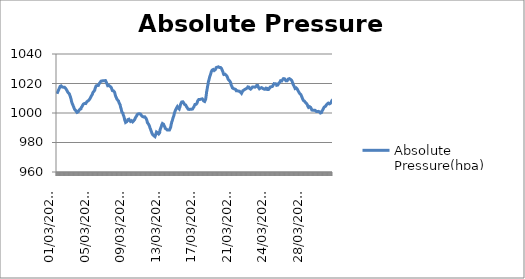
| Category | Absolute Pressure(hpa) |
|---|---|
|  01/03/2022 00:20:09 | 1013 |
|  01/03/2022 00:50:09 | 1013.4 |
|  01/03/2022 01:20:09 | 1013.9 |
|  01/03/2022 01:50:09 | 1014.2 |
|  01/03/2022 02:20:09 | 1014.2 |
|  01/03/2022 02:50:09 | 1014.7 |
|  01/03/2022 03:20:09 | 1015 |
|  01/03/2022 03:50:09 | 1015.4 |
|  01/03/2022 04:20:09 | 1015.5 |
|  01/03/2022 04:50:09 | 1015.8 |
|  01/03/2022 05:20:09 | 1016.2 |
|  01/03/2022 05:50:09 | 1016.1 |
|  01/03/2022 06:20:09 | 1016.4 |
|  01/03/2022 06:50:09 | 1017 |
|  01/03/2022 07:20:09 | 1017.1 |
|  01/03/2022 07:50:09 | 1017.5 |
|  01/03/2022 08:20:09 | 1018 |
|  01/03/2022 08:50:09 | 1017.9 |
|  01/03/2022 09:20:09 | 1018.4 |
|  01/03/2022 09:50:09 | 1018.4 |
|  01/03/2022 10:20:09 | 1018.3 |
|  01/03/2022 10:50:09 | 1018.1 |
|  01/03/2022 11:20:09 | 1018.4 |
|  01/03/2022 11:50:09 | 1018.5 |
|  01/03/2022 12:20:09 | 1018.3 |
|  01/03/2022 12:50:09 | 1018.2 |
|  01/03/2022 15:54:06 | 1017.9 |
|  01/03/2022 16:24:06 | 1017.9 |
|  01/03/2022 16:54:06 | 1017.6 |
|  01/03/2022 17:24:06 | 1017.4 |
|  01/03/2022 17:54:06 | 1017.5 |
|  01/03/2022 18:24:06 | 1017.3 |
|  01/03/2022 18:54:06 | 1017.3 |
|  01/03/2022 19:24:06 | 1017.6 |
|  01/03/2022 19:54:06 | 1017.5 |
|  01/03/2022 20:24:06 | 1017.7 |
|  01/03/2022 20:54:06 | 1017.8 |
|  01/03/2022 21:24:06 | 1017.3 |
|  01/03/2022 21:54:06 | 1017.4 |
|  01/03/2022 22:24:06 | 1017.6 |
|  01/03/2022 22:54:06 | 1017.5 |
|  01/03/2022 23:24:06 | 1017.5 |
|  01/03/2022 23:54:06 | 1017.1 |
|  02/03/2022 00:24:06 | 1016.9 |
|  02/03/2022 00:54:06 | 1017 |
|  02/03/2022 01:24:06 | 1016.8 |
|  02/03/2022 01:54:06 | 1016.5 |
|  02/03/2022 02:24:06 | 1016.4 |
|  02/03/2022 02:54:06 | 1016.3 |
|  02/03/2022 03:24:06 | 1016.1 |
|  02/03/2022 03:54:06 | 1016.1 |
|  02/03/2022 04:24:06 | 1016 |
|  02/03/2022 04:54:06 | 1015.8 |
|  02/03/2022 05:24:06 | 1015.2 |
|  02/03/2022 05:54:06 | 1015 |
|  02/03/2022 06:24:06 | 1014.9 |
|  02/03/2022 06:54:06 | 1014.4 |
|  02/03/2022 07:24:06 | 1014 |
|  02/03/2022 07:54:06 | 1014.1 |
|  02/03/2022 08:24:06 | 1014.2 |
|  02/03/2022 08:54:06 | 1013.7 |
|  02/03/2022 09:24:06 | 1013.5 |
|  02/03/2022 09:54:06 | 1013.6 |
|  02/03/2022 10:24:06 | 1013.8 |
|  02/03/2022 10:54:06 | 1013.5 |
|  02/03/2022 11:24:06 | 1013.2 |
|  02/03/2022 11:54:06 | 1012.9 |
|  02/03/2022 12:24:06 | 1012.5 |
|  02/03/2022 12:54:06 | 1012.2 |
|  02/03/2022 13:24:06 | 1012.4 |
|  02/03/2022 13:54:06 | 1011.8 |
|  02/03/2022 14:24:06 | 1011.1 |
|  02/03/2022 14:54:06 | 1010.8 |
|  02/03/2022 15:24:06 | 1010.3 |
|  02/03/2022 15:54:06 | 1010 |
|  02/03/2022 16:24:06 | 1009.5 |
|  02/03/2022 16:54:06 | 1008.8 |
|  02/03/2022 17:24:06 | 1008.3 |
|  02/03/2022 17:54:06 | 1007.6 |
|  02/03/2022 18:24:06 | 1007.2 |
|  02/03/2022 18:54:06 | 1007 |
|  02/03/2022 19:24:06 | 1006.5 |
|  02/03/2022 19:54:06 | 1006.4 |
|  02/03/2022 20:24:06 | 1006.1 |
|  02/03/2022 20:54:06 | 1005.7 |
|  02/03/2022 21:24:06 | 1005.6 |
|  02/03/2022 21:54:06 | 1005 |
|  02/03/2022 22:24:06 | 1004.8 |
|  02/03/2022 22:54:06 | 1004.5 |
|  02/03/2022 23:24:06 | 1004.1 |
|  02/03/2022 23:54:06 | 1003.6 |
|  03/03/2022 00:24:06 | 1003.4 |
|  03/03/2022 00:54:06 | 1003.1 |
|  03/03/2022 01:24:06 | 1002.9 |
|  03/03/2022 01:54:06 | 1002.5 |
|  03/03/2022 02:24:06 | 1002.9 |
|  03/03/2022 02:54:06 | 1002.5 |
|  03/03/2022 03:24:06 | 1002.5 |
|  03/03/2022 03:54:06 | 1002.4 |
|  03/03/2022 04:24:06 | 1002 |
|  03/03/2022 04:54:06 | 1001.8 |
|  03/03/2022 05:24:06 | 1001.5 |
|  03/03/2022 05:54:06 | 1001.1 |
|  03/03/2022 06:24:06 | 1000.8 |
|  03/03/2022 06:54:06 | 1000.7 |
|  03/03/2022 07:24:06 | 1000.5 |
|  03/03/2022 07:54:06 | 1000.5 |
|  03/03/2022 08:24:06 | 1000.4 |
|  03/03/2022 08:54:06 | 1000.1 |
|  03/03/2022 09:24:06 | 1000.6 |
|  03/03/2022 09:54:06 | 1000.4 |
|  03/03/2022 10:24:06 | 1000.6 |
|  03/03/2022 10:54:06 | 1000.4 |
|  03/03/2022 11:24:06 | 1000.8 |
|  03/03/2022 11:54:06 | 1001 |
|  03/03/2022 12:24:06 | 1001.2 |
|  03/03/2022 12:54:06 | 1001.5 |
|  03/03/2022 13:24:06 | 1001.5 |
|  03/03/2022 13:54:06 | 1001.8 |
|  03/03/2022 14:24:06 | 1001.9 |
|  03/03/2022 14:54:06 | 1001.9 |
|  03/03/2022 15:24:06 | 1002.1 |
|  03/03/2022 15:54:06 | 1002.4 |
|  03/03/2022 16:24:06 | 1002.6 |
|  03/03/2022 16:54:06 | 1002.8 |
|  03/03/2022 17:24:06 | 1002.6 |
|  03/03/2022 17:54:06 | 1002.8 |
|  03/03/2022 18:24:06 | 1002.6 |
|  03/03/2022 18:54:06 | 1002.8 |
|  03/03/2022 19:24:06 | 1003.5 |
|  03/03/2022 19:54:06 | 1003.5 |
|  03/03/2022 20:24:06 | 1003.8 |
|  03/03/2022 20:54:06 | 1003.8 |
|  03/03/2022 21:24:06 | 1004.1 |
|  03/03/2022 21:54:06 | 1004.4 |
|  03/03/2022 22:24:06 | 1004.5 |
|  03/03/2022 22:54:06 | 1004.8 |
|  03/03/2022 23:24:06 | 1004.9 |
|  03/03/2022 23:54:06 | 1005.4 |
|  04/03/2022 00:24:06 | 1005.4 |
|  04/03/2022 00:54:06 | 1005.6 |
|  04/03/2022 01:24:06 | 1005.8 |
|  04/03/2022 01:54:06 | 1006.1 |
|  04/03/2022 02:24:06 | 1006.3 |
|  04/03/2022 02:54:06 | 1006.3 |
|  04/03/2022 03:24:06 | 1006.4 |
|  04/03/2022 03:54:06 | 1006.3 |
|  04/03/2022 04:24:06 | 1006.4 |
|  04/03/2022 04:54:06 | 1006.5 |
|  04/03/2022 05:24:06 | 1006.7 |
|  04/03/2022 05:54:06 | 1006.4 |
|  04/03/2022 06:24:06 | 1006.8 |
|  04/03/2022 06:54:06 | 1006.5 |
|  04/03/2022 07:24:06 | 1006.6 |
|  04/03/2022 07:54:06 | 1006.4 |
|  04/03/2022 08:24:06 | 1006.8 |
|  04/03/2022 08:54:06 | 1007 |
|  04/03/2022 09:24:06 | 1006.8 |
|  04/03/2022 09:54:06 | 1006.9 |
|  04/03/2022 10:24:06 | 1007.5 |
|  04/03/2022 10:54:06 | 1007.5 |
|  04/03/2022 11:24:06 | 1007.6 |
|  04/03/2022 11:54:06 | 1008 |
|  04/03/2022 12:24:06 | 1007.9 |
|  04/03/2022 12:54:06 | 1008 |
|  04/03/2022 13:24:06 | 1008.1 |
|  04/03/2022 13:54:06 | 1008.2 |
|  04/03/2022 14:24:06 | 1008.3 |
|  04/03/2022 14:54:06 | 1008.3 |
|  04/03/2022 15:24:06 | 1008.4 |
|  04/03/2022 15:54:06 | 1008.6 |
|  04/03/2022 16:24:06 | 1008.7 |
|  04/03/2022 16:54:06 | 1008.5 |
|  04/03/2022 17:24:06 | 1008.7 |
|  04/03/2022 17:54:06 | 1008.8 |
|  04/03/2022 18:24:06 | 1009.3 |
|  04/03/2022 18:54:06 | 1009.3 |
|  04/03/2022 19:24:06 | 1009.8 |
|  04/03/2022 19:54:06 | 1010.1 |
|  04/03/2022 20:24:06 | 1010.1 |
|  04/03/2022 20:54:06 | 1010.5 |
|  04/03/2022 21:24:06 | 1010.7 |
|  04/03/2022 21:54:06 | 1010.9 |
|  04/03/2022 22:24:06 | 1011.4 |
|  04/03/2022 22:54:06 | 1011.6 |
|  04/03/2022 23:24:06 | 1011.8 |
|  04/03/2022 23:54:06 | 1011.8 |
|  05/03/2022 00:24:06 | 1012.1 |
|  05/03/2022 00:54:06 | 1012.4 |
|  05/03/2022 01:24:06 | 1012.7 |
|  05/03/2022 01:54:06 | 1012.9 |
|  05/03/2022 02:24:06 | 1013.2 |
|  05/03/2022 02:54:06 | 1013.8 |
|  05/03/2022 03:24:06 | 1013.8 |
|  05/03/2022 03:54:06 | 1014.1 |
|  05/03/2022 04:24:06 | 1014.2 |
|  05/03/2022 04:54:06 | 1014.3 |
|  05/03/2022 05:24:06 | 1014.6 |
|  05/03/2022 05:54:06 | 1015.1 |
|  05/03/2022 06:24:06 | 1015.1 |
|  05/03/2022 06:54:06 | 1015.2 |
|  05/03/2022 07:24:06 | 1015.2 |
|  05/03/2022 07:54:06 | 1015.4 |
|  05/03/2022 08:24:06 | 1015.9 |
|  05/03/2022 08:54:06 | 1016.5 |
|  05/03/2022 09:24:06 | 1016.7 |
|  05/03/2022 09:54:06 | 1016.9 |
|  05/03/2022 10:24:06 | 1017.6 |
|  05/03/2022 10:54:06 | 1017.6 |
|  05/03/2022 11:24:06 | 1017.8 |
|  05/03/2022 11:54:06 | 1018.4 |
|  05/03/2022 12:24:06 | 1018.7 |
|  05/03/2022 12:54:06 | 1018.7 |
|  05/03/2022 13:24:06 | 1018.7 |
|  05/03/2022 13:54:06 | 1018.5 |
|  05/03/2022 14:24:06 | 1018.7 |
|  05/03/2022 14:54:06 | 1018.6 |
|  05/03/2022 15:24:06 | 1018.8 |
|  05/03/2022 15:54:06 | 1018.6 |
|  05/03/2022 16:24:06 | 1018.8 |
|  05/03/2022 16:54:06 | 1019.1 |
|  05/03/2022 17:24:06 | 1018.8 |
|  05/03/2022 17:54:06 | 1018.7 |
|  05/03/2022 18:24:06 | 1019 |
|  05/03/2022 18:54:06 | 1019.4 |
|  05/03/2022 19:24:06 | 1019.6 |
|  05/03/2022 19:54:06 | 1020 |
|  05/03/2022 20:24:06 | 1020 |
|  05/03/2022 20:54:06 | 1020.2 |
|  05/03/2022 21:24:06 | 1020.3 |
|  05/03/2022 21:54:06 | 1020.5 |
|  05/03/2022 22:24:06 | 1020.8 |
|  05/03/2022 22:54:06 | 1020.9 |
|  05/03/2022 23:24:06 | 1021.2 |
|  05/03/2022 23:54:06 | 1021.3 |
|  06/03/2022 00:24:06 | 1021.4 |
|  06/03/2022 00:54:06 | 1021.6 |
|  06/03/2022 01:24:06 | 1021.6 |
|  06/03/2022 01:54:06 | 1021.6 |
|  06/03/2022 02:24:06 | 1021.7 |
|  06/03/2022 02:54:06 | 1021.5 |
|  06/03/2022 03:24:06 | 1021.6 |
|  06/03/2022 03:54:06 | 1021.7 |
|  06/03/2022 04:24:06 | 1022.1 |
|  06/03/2022 04:54:06 | 1021.9 |
|  06/03/2022 05:24:06 | 1022 |
|  06/03/2022 05:54:06 | 1021.9 |
|  06/03/2022 06:24:06 | 1022 |
|  06/03/2022 06:54:06 | 1021.9 |
|  06/03/2022 07:24:06 | 1022 |
|  06/03/2022 07:54:06 | 1022 |
|  06/03/2022 08:24:06 | 1022 |
|  06/03/2022 08:54:06 | 1021.9 |
|  06/03/2022 09:24:06 | 1021.8 |
|  06/03/2022 09:54:06 | 1021.9 |
|  06/03/2022 10:24:06 | 1021.9 |
|  06/03/2022 10:54:06 | 1021.8 |
|  06/03/2022 11:24:06 | 1021.7 |
|  06/03/2022 11:54:06 | 1022 |
|  06/03/2022 12:24:06 | 1022 |
|  06/03/2022 12:54:06 | 1022 |
|  06/03/2022 13:24:06 | 1021.7 |
|  06/03/2022 13:54:06 | 1021.7 |
|  06/03/2022 14:24:06 | 1021.3 |
|  06/03/2022 14:54:06 | 1021.2 |
|  06/03/2022 15:24:06 | 1020.8 |
|  06/03/2022 15:54:06 | 1020.4 |
|  06/03/2022 16:24:06 | 1020.3 |
|  06/03/2022 16:54:06 | 1019.7 |
|  06/03/2022 17:24:06 | 1019.4 |
|  06/03/2022 17:54:06 | 1019.2 |
|  06/03/2022 18:24:06 | 1019.2 |
|  06/03/2022 18:54:06 | 1018.5 |
|  06/03/2022 19:24:06 | 1018.7 |
|  06/03/2022 19:54:06 | 1018.7 |
|  06/03/2022 20:24:06 | 1018.4 |
|  06/03/2022 20:54:06 | 1018.5 |
|  06/03/2022 21:24:06 | 1018.5 |
|  06/03/2022 21:54:06 | 1018.7 |
|  06/03/2022 22:24:06 | 1018.7 |
|  06/03/2022 22:54:06 | 1018.7 |
|  06/03/2022 23:24:06 | 1018.5 |
|  06/03/2022 23:54:06 | 1018.3 |
|  07/03/2022 00:24:06 | 1018.5 |
|  07/03/2022 00:54:06 | 1018.1 |
|  07/03/2022 01:24:06 | 1018.1 |
|  07/03/2022 01:54:06 | 1017.7 |
|  07/03/2022 02:24:06 | 1017.7 |
|  07/03/2022 02:54:06 | 1017.6 |
|  07/03/2022 03:24:06 | 1017.6 |
|  07/03/2022 03:54:06 | 1017.4 |
|  07/03/2022 04:24:06 | 1017.3 |
|  07/03/2022 04:54:06 | 1017 |
|  07/03/2022 05:24:06 | 1016.7 |
|  07/03/2022 05:54:06 | 1016.4 |
|  07/03/2022 06:24:06 | 1015.9 |
|  07/03/2022 06:54:06 | 1015.3 |
|  07/03/2022 07:24:06 | 1015.2 |
|  07/03/2022 07:54:06 | 1015.1 |
|  07/03/2022 08:24:06 | 1015.1 |
|  07/03/2022 08:54:06 | 1015 |
|  07/03/2022 09:24:06 | 1014.8 |
|  07/03/2022 09:54:06 | 1014.6 |
|  07/03/2022 10:24:06 | 1015 |
|  07/03/2022 10:54:06 | 1014.8 |
|  07/03/2022 11:24:06 | 1014.7 |
|  07/03/2022 11:54:06 | 1014.7 |
|  07/03/2022 12:24:06 | 1014.4 |
|  07/03/2022 12:54:06 | 1014.3 |
|  07/03/2022 13:24:06 | 1013.9 |
|  07/03/2022 13:54:06 | 1013.5 |
|  07/03/2022 14:24:06 | 1013.2 |
|  07/03/2022 14:54:06 | 1012.9 |
|  07/03/2022 15:24:06 | 1012.1 |
|  07/03/2022 15:54:06 | 1011.8 |
|  07/03/2022 16:24:06 | 1011.2 |
|  07/03/2022 16:54:06 | 1011 |
|  07/03/2022 17:24:06 | 1010.7 |
|  07/03/2022 17:54:06 | 1010.5 |
|  07/03/2022 18:24:06 | 1009.9 |
|  07/03/2022 18:54:06 | 1009.7 |
|  07/03/2022 19:24:06 | 1009.5 |
|  07/03/2022 19:54:06 | 1009.6 |
|  07/03/2022 20:24:06 | 1009.1 |
|  07/03/2022 20:54:06 | 1009 |
|  07/03/2022 21:24:06 | 1008.6 |
|  07/03/2022 21:54:06 | 1008.6 |
|  07/03/2022 22:24:06 | 1008.5 |
|  07/03/2022 22:54:06 | 1008.5 |
|  07/03/2022 23:24:06 | 1008.5 |
|  07/03/2022 23:54:06 | 1008.1 |
|  08/03/2022 00:24:06 | 1007.5 |
|  08/03/2022 00:54:06 | 1007.2 |
|  08/03/2022 01:24:06 | 1007 |
|  08/03/2022 01:54:06 | 1006.9 |
|  08/03/2022 02:24:06 | 1006.6 |
|  08/03/2022 02:54:06 | 1006.2 |
|  08/03/2022 03:24:06 | 1006 |
|  08/03/2022 03:54:06 | 1005.6 |
|  08/03/2022 04:24:06 | 1005.4 |
|  08/03/2022 04:54:06 | 1004.9 |
|  08/03/2022 05:24:06 | 1004 |
|  08/03/2022 05:54:06 | 1003.8 |
|  08/03/2022 06:24:06 | 1003.5 |
|  08/03/2022 06:54:06 | 1003 |
|  08/03/2022 07:24:06 | 1002.7 |
|  08/03/2022 07:54:06 | 1001.8 |
|  08/03/2022 08:24:06 | 1001.8 |
|  08/03/2022 08:54:06 | 1000.6 |
|  08/03/2022 09:24:06 | 1000.5 |
|  08/03/2022 09:54:06 | 1000.4 |
|  08/03/2022 10:24:06 | 1000.5 |
|  08/03/2022 10:54:06 | 1000.3 |
|  08/03/2022 11:24:06 | 1000.2 |
|  08/03/2022 11:54:06 | 999.9 |
|  08/03/2022 12:24:06 | 998.8 |
|  08/03/2022 12:54:06 | 999.4 |
|  08/03/2022 13:24:06 | 998.6 |
|  08/03/2022 13:54:06 | 998 |
|  08/03/2022 14:24:06 | 997.7 |
|  08/03/2022 14:54:06 | 997.1 |
|  08/03/2022 15:24:06 | 996.9 |
|  08/03/2022 15:54:06 | 996.2 |
|  08/03/2022 16:24:06 | 995.3 |
|  08/03/2022 16:54:06 | 995.5 |
|  08/03/2022 17:24:06 | 995 |
|  08/03/2022 17:54:06 | 994.4 |
|  08/03/2022 18:24:06 | 993.9 |
|  08/03/2022 18:54:06 | 993.6 |
|  08/03/2022 19:24:06 | 993.5 |
|  08/03/2022 19:54:06 | 993.4 |
|  08/03/2022 20:24:06 | 993.3 |
|  08/03/2022 20:54:06 | 993.3 |
|  08/03/2022 21:24:06 | 993.6 |
|  08/03/2022 21:54:06 | 994.1 |
|  08/03/2022 22:24:06 | 994.1 |
|  08/03/2022 22:54:06 | 994.5 |
|  08/03/2022 23:24:06 | 994.6 |
|  08/03/2022 23:54:06 | 994.6 |
|  09/03/2022 00:24:06 | 994.8 |
|  09/03/2022 00:54:06 | 995.5 |
|  09/03/2022 01:24:06 | 995.3 |
|  09/03/2022 01:54:06 | 996.1 |
|  09/03/2022 02:24:06 | 995.9 |
|  09/03/2022 02:54:06 | 995.7 |
|  09/03/2022 03:24:06 | 995.6 |
|  09/03/2022 03:54:06 | 995.8 |
|  09/03/2022 04:24:06 | 995.9 |
|  09/03/2022 04:54:06 | 995.4 |
|  09/03/2022 05:24:06 | 995.1 |
|  09/03/2022 05:54:06 | 994.9 |
|  09/03/2022 06:24:06 | 994.6 |
|  09/03/2022 06:54:06 | 994.6 |
|  09/03/2022 07:24:06 | 994.5 |
|  09/03/2022 07:54:06 | 994.3 |
|  09/03/2022 08:24:06 | 994.3 |
|  09/03/2022 08:54:06 | 994.1 |
|  09/03/2022 09:24:06 | 994.2 |
|  09/03/2022 09:54:06 | 994.5 |
|  09/03/2022 10:24:06 | 994.6 |
|  09/03/2022 10:54:06 | 994.8 |
|  09/03/2022 11:24:06 | 994.8 |
|  09/03/2022 11:54:06 | 994.6 |
|  09/03/2022 12:24:06 | 994.9 |
|  09/03/2022 12:54:06 | 994.4 |
|  09/03/2022 13:24:06 | 994.5 |
|  09/03/2022 13:54:06 | 994 |
|  09/03/2022 14:24:06 | 994.3 |
|  09/03/2022 14:54:06 | 994.3 |
|  09/03/2022 15:24:06 | 994.3 |
|  09/03/2022 15:54:06 | 994.4 |
|  09/03/2022 16:24:06 | 994.2 |
|  09/03/2022 16:54:06 | 994.8 |
|  09/03/2022 17:24:06 | 994.8 |
|  09/03/2022 17:54:06 | 995.1 |
|  09/03/2022 18:24:06 | 995 |
|  09/03/2022 18:54:06 | 995.2 |
|  09/03/2022 19:24:06 | 995.6 |
|  09/03/2022 19:54:06 | 996.1 |
|  09/03/2022 20:24:06 | 996.4 |
|  09/03/2022 20:54:06 | 996.8 |
|  09/03/2022 21:24:06 | 996.9 |
|  09/03/2022 21:54:06 | 997 |
|  09/03/2022 22:24:06 | 997.2 |
|  09/03/2022 22:54:06 | 997.4 |
|  09/03/2022 23:24:06 | 997.7 |
|  09/03/2022 23:54:06 | 997.8 |
|  10/03/2022 00:24:06 | 997.8 |
|  10/03/2022 00:54:06 | 998.2 |
|  10/03/2022 01:24:06 | 998.3 |
|  10/03/2022 01:54:06 | 998.9 |
|  10/03/2022 02:24:06 | 999.3 |
|  10/03/2022 02:54:06 | 999.1 |
|  10/03/2022 03:24:06 | 999.2 |
|  10/03/2022 03:54:06 | 999.3 |
|  10/03/2022 04:24:06 | 999.3 |
|  10/03/2022 04:54:06 | 999.4 |
|  10/03/2022 05:24:06 | 999.5 |
|  10/03/2022 05:54:06 | 999.4 |
|  10/03/2022 06:24:06 | 999.5 |
|  10/03/2022 06:54:06 | 999.5 |
|  10/03/2022 07:24:06 | 999.5 |
|  10/03/2022 07:54:06 | 999.5 |
|  10/03/2022 08:24:06 | 999.4 |
|  10/03/2022 08:54:06 | 999.2 |
|  10/03/2022 09:24:06 | 999.1 |
|  10/03/2022 09:54:06 | 999.5 |
|  10/03/2022 10:24:06 | 999.4 |
|  10/03/2022 10:54:06 | 999.3 |
|  10/03/2022 11:24:06 | 999.4 |
|  10/03/2022 11:54:06 | 999.2 |
|  10/03/2022 12:24:06 | 998.9 |
|  10/03/2022 12:54:06 | 998.9 |
|  10/03/2022 13:24:06 | 998.4 |
|  10/03/2022 13:54:06 | 998.4 |
|  10/03/2022 14:24:06 | 998.2 |
|  10/03/2022 14:54:06 | 997.9 |
|  10/03/2022 15:24:06 | 997.9 |
|  10/03/2022 15:54:06 | 997.8 |
|  10/03/2022 16:24:06 | 997.6 |
|  10/03/2022 16:54:06 | 997.5 |
|  10/03/2022 17:24:06 | 997.3 |
|  10/03/2022 17:54:06 | 997.2 |
|  10/03/2022 18:24:06 | 997.1 |
|  10/03/2022 18:54:06 | 997.2 |
|  10/03/2022 19:24:06 | 997.3 |
|  10/03/2022 19:54:06 | 997.1 |
|  10/03/2022 20:24:06 | 997 |
|  10/03/2022 20:54:06 | 997 |
|  10/03/2022 21:24:06 | 996.8 |
|  10/03/2022 21:54:06 | 997.1 |
|  10/03/2022 22:24:06 | 997.4 |
|  10/03/2022 22:54:06 | 997.1 |
|  10/03/2022 23:24:06 | 997.2 |
|  10/03/2022 23:54:06 | 996.9 |
|  11/03/2022 00:24:06 | 997 |
|  11/03/2022 00:54:06 | 996.7 |
|  11/03/2022 01:24:06 | 996.4 |
|  11/03/2022 01:54:06 | 996.3 |
|  11/03/2022 02:24:06 | 996.2 |
|  11/03/2022 02:54:06 | 995.9 |
|  11/03/2022 03:24:06 | 995.6 |
|  11/03/2022 03:54:06 | 995 |
|  11/03/2022 04:24:06 | 994.6 |
|  11/03/2022 04:54:06 | 994.3 |
|  11/03/2022 05:24:06 | 993.5 |
|  11/03/2022 05:54:06 | 993.3 |
|  11/03/2022 06:24:06 | 993.5 |
|  11/03/2022 06:54:06 | 993.2 |
|  11/03/2022 07:24:06 | 993.2 |
|  11/03/2022 07:54:06 | 992.7 |
|  11/03/2022 08:24:06 | 992.6 |
|  11/03/2022 08:54:06 | 992.6 |
|  11/03/2022 09:24:06 | 992.2 |
|  11/03/2022 09:54:06 | 991.7 |
|  11/03/2022 10:24:06 | 991.4 |
|  11/03/2022 10:54:06 | 991.1 |
|  11/03/2022 11:24:06 | 990.9 |
|  11/03/2022 11:54:06 | 990.5 |
|  11/03/2022 12:24:06 | 989.9 |
|  11/03/2022 12:54:06 | 990 |
|  11/03/2022 13:24:06 | 989.3 |
|  11/03/2022 13:54:06 | 989.1 |
|  11/03/2022 14:24:06 | 988.7 |
|  11/03/2022 14:54:06 | 988.3 |
|  11/03/2022 15:24:06 | 987.7 |
|  11/03/2022 15:54:06 | 987.6 |
|  11/03/2022 16:24:06 | 987.3 |
|  11/03/2022 16:54:06 | 986.9 |
|  11/03/2022 17:24:06 | 986.6 |
|  11/03/2022 17:54:06 | 986.2 |
|  11/03/2022 18:24:06 | 986 |
|  11/03/2022 18:54:06 | 985.6 |
|  11/03/2022 19:24:06 | 985.7 |
|  11/03/2022 19:54:06 | 985.3 |
|  11/03/2022 20:24:06 | 985.4 |
|  11/03/2022 20:54:06 | 984.9 |
|  11/03/2022 21:24:06 | 985 |
|  11/03/2022 21:54:06 | 985 |
|  11/03/2022 22:24:06 | 984.9 |
|  11/03/2022 22:54:06 | 984.6 |
|  11/03/2022 23:24:06 | 984.5 |
|  11/03/2022 23:54:06 | 984.3 |
|  12/03/2022 00:24:06 | 984.2 |
|  12/03/2022 00:54:06 | 984.1 |
|  12/03/2022 01:24:06 | 984.2 |
|  12/03/2022 01:54:06 | 984 |
|  12/03/2022 02:24:06 | 984.3 |
|  12/03/2022 02:54:06 | 984.7 |
|  12/03/2022 03:24:06 | 985.1 |
|  12/03/2022 03:54:06 | 985.3 |
|  12/03/2022 04:24:06 | 985.9 |
|  12/03/2022 04:54:06 | 986.2 |
|  12/03/2022 05:24:06 | 986.4 |
|  12/03/2022 05:54:06 | 987.1 |
|  12/03/2022 06:24:06 | 987 |
|  12/03/2022 06:54:06 | 986.9 |
|  12/03/2022 07:24:06 | 987 |
|  12/03/2022 07:54:06 | 987 |
|  12/03/2022 08:24:06 | 986.8 |
|  12/03/2022 08:54:06 | 986.6 |
|  12/03/2022 09:24:06 | 986.5 |
|  12/03/2022 09:54:06 | 986.5 |
|  12/03/2022 10:24:06 | 986.2 |
|  12/03/2022 10:54:06 | 986.2 |
|  12/03/2022 11:24:06 | 986.3 |
|  12/03/2022 11:54:06 | 985.8 |
|  12/03/2022 12:24:06 | 986 |
|  12/03/2022 12:54:06 | 986.1 |
|  12/03/2022 13:24:06 | 985.6 |
|  12/03/2022 13:54:06 | 985.9 |
|  12/03/2022 14:24:06 | 986.6 |
|  12/03/2022 14:54:06 | 987.7 |
|  12/03/2022 15:24:06 | 988.5 |
|  12/03/2022 15:54:06 | 988.7 |
|  12/03/2022 16:24:06 | 989 |
|  12/03/2022 16:54:06 | 989.6 |
|  12/03/2022 17:24:06 | 989.7 |
|  12/03/2022 17:54:06 | 990.1 |
|  12/03/2022 18:24:06 | 990.5 |
|  12/03/2022 18:54:06 | 990.7 |
|  12/03/2022 19:24:06 | 991.3 |
|  12/03/2022 19:54:06 | 991.5 |
|  12/03/2022 20:24:06 | 992.2 |
|  12/03/2022 20:54:06 | 992.7 |
|  12/03/2022 21:24:06 | 992.6 |
|  12/03/2022 21:54:06 | 992.9 |
|  12/03/2022 22:24:06 | 993.4 |
|  12/03/2022 22:54:06 | 992.9 |
|  12/03/2022 23:24:06 | 992.8 |
|  12/03/2022 23:54:06 | 992.8 |
|  13/03/2022 00:24:06 | 992.8 |
|  13/03/2022 00:54:06 | 992.4 |
|  13/03/2022 01:24:06 | 992.2 |
|  13/03/2022 01:54:06 | 991.7 |
|  13/03/2022 02:24:06 | 991.5 |
|  13/03/2022 02:54:06 | 991.3 |
|  13/03/2022 03:24:06 | 991 |
|  13/03/2022 03:54:06 | 990.7 |
|  13/03/2022 04:24:06 | 990.5 |
|  13/03/2022 04:54:06 | 990.3 |
|  13/03/2022 05:24:06 | 989.6 |
|  13/03/2022 05:54:06 | 989.5 |
|  13/03/2022 06:24:06 | 989.5 |
|  13/03/2022 06:54:06 | 989.4 |
|  13/03/2022 07:24:06 | 989.2 |
|  13/03/2022 07:54:06 | 989 |
|  13/03/2022 08:24:06 | 989.1 |
|  13/03/2022 08:54:06 | 989.2 |
|  13/03/2022 09:24:06 | 989.1 |
|  13/03/2022 09:54:06 | 988.8 |
|  13/03/2022 10:24:06 | 988.8 |
|  13/03/2022 10:54:06 | 988.4 |
|  13/03/2022 11:24:06 | 988.2 |
|  13/03/2022 11:54:06 | 988.2 |
|  13/03/2022 12:24:06 | 988.2 |
|  13/03/2022 12:54:06 | 988.3 |
|  13/03/2022 13:24:06 | 988.5 |
|  13/03/2022 13:54:06 | 988.4 |
|  13/03/2022 14:24:06 | 988.5 |
|  13/03/2022 14:54:06 | 988.5 |
|  13/03/2022 15:24:06 | 988.7 |
|  13/03/2022 15:54:06 | 988.7 |
|  13/03/2022 16:24:06 | 988.8 |
|  13/03/2022 16:54:06 | 988.5 |
|  13/03/2022 17:24:06 | 988.7 |
|  13/03/2022 17:54:06 | 988.7 |
|  13/03/2022 18:24:06 | 989.4 |
|  13/03/2022 18:54:06 | 989.2 |
|  13/03/2022 19:24:06 | 989.7 |
|  13/03/2022 19:54:06 | 990.3 |
|  13/03/2022 20:24:06 | 990.9 |
|  13/03/2022 20:54:06 | 991.5 |
|  13/03/2022 21:24:06 | 992.3 |
|  13/03/2022 21:54:06 | 992.7 |
|  13/03/2022 22:24:06 | 993 |
|  13/03/2022 22:54:06 | 994 |
|  13/03/2022 23:24:06 | 993.9 |
|  13/03/2022 23:54:06 | 994.4 |
|  14/03/2022 00:24:06 | 994.8 |
|  14/03/2022 00:54:06 | 995 |
|  14/03/2022 01:24:06 | 995.8 |
|  14/03/2022 01:54:06 | 995.9 |
|  14/03/2022 02:24:06 | 996.7 |
|  14/03/2022 02:54:06 | 996.7 |
|  14/03/2022 03:24:06 | 997.1 |
|  14/03/2022 03:54:06 | 997.8 |
|  14/03/2022 04:24:06 | 998.1 |
|  14/03/2022 04:54:06 | 998.5 |
|  14/03/2022 05:24:06 | 999 |
|  14/03/2022 05:54:06 | 999.8 |
|  14/03/2022 06:24:06 | 1000 |
|  14/03/2022 06:54:06 | 1000.3 |
|  14/03/2022 07:24:06 | 1000.9 |
|  14/03/2022 07:54:06 | 1001.2 |
|  14/03/2022 08:24:06 | 1001.3 |
|  14/03/2022 08:54:06 | 1001.9 |
|  14/03/2022 09:24:06 | 1002.2 |
|  14/03/2022 09:54:06 | 1002.5 |
|  14/03/2022 10:24:06 | 1002.6 |
|  14/03/2022 10:54:06 | 1003 |
|  14/03/2022 11:24:06 | 1003.2 |
|  14/03/2022 11:54:06 | 1003.5 |
|  14/03/2022 12:24:06 | 1003.7 |
|  14/03/2022 12:54:06 | 1004 |
|  14/03/2022 13:24:06 | 1004 |
|  14/03/2022 13:54:06 | 1004.3 |
|  14/03/2022 14:24:06 | 1004 |
|  14/03/2022 14:54:06 | 1004.2 |
|  14/03/2022 15:24:06 | 1004 |
|  14/03/2022 15:54:06 | 1003.4 |
|  14/03/2022 16:24:06 | 1003.2 |
|  14/03/2022 16:54:06 | 1003.4 |
|  14/03/2022 17:24:06 | 1003 |
|  14/03/2022 17:54:06 | 1003.1 |
|  14/03/2022 18:24:06 | 1002.8 |
|  14/03/2022 18:54:06 | 1002.7 |
|  14/03/2022 19:24:06 | 1003 |
|  14/03/2022 19:54:06 | 1003.5 |
|  14/03/2022 20:24:06 | 1003.7 |
|  14/03/2022 20:54:06 | 1004.2 |
|  14/03/2022 21:24:06 | 1004.7 |
|  14/03/2022 21:54:06 | 1005.2 |
|  14/03/2022 22:24:06 | 1005.5 |
|  14/03/2022 22:54:06 | 1005.7 |
|  14/03/2022 23:24:06 | 1006.4 |
|  14/03/2022 23:54:06 | 1006.5 |
|  15/03/2022 00:24:06 | 1006.7 |
|  15/03/2022 00:54:06 | 1006.7 |
|  15/03/2022 01:24:06 | 1007 |
|  15/03/2022 01:54:06 | 1007.5 |
|  15/03/2022 02:24:06 | 1007.4 |
|  15/03/2022 02:54:06 | 1007.6 |
|  15/03/2022 03:24:06 | 1007.2 |
|  15/03/2022 03:54:06 | 1007.4 |
|  15/03/2022 04:24:06 | 1007.4 |
|  15/03/2022 04:54:06 | 1007.6 |
|  15/03/2022 05:24:06 | 1007.3 |
|  15/03/2022 05:54:06 | 1007.2 |
|  15/03/2022 06:24:06 | 1007 |
|  15/03/2022 06:54:06 | 1006.9 |
|  15/03/2022 07:24:06 | 1006.9 |
|  15/03/2022 07:54:06 | 1006.7 |
|  15/03/2022 08:24:06 | 1006.7 |
|  15/03/2022 08:54:06 | 1006.3 |
|  15/03/2022 09:24:06 | 1005.8 |
|  15/03/2022 09:54:06 | 1006.1 |
|  15/03/2022 10:24:06 | 1005.8 |
|  15/03/2022 10:54:06 | 1005.8 |
|  15/03/2022 11:24:06 | 1005.8 |
|  15/03/2022 11:54:06 | 1005.6 |
|  15/03/2022 12:24:06 | 1005.4 |
|  15/03/2022 12:54:06 | 1005.2 |
|  15/03/2022 13:24:06 | 1005.2 |
|  15/03/2022 13:54:06 | 1004.9 |
|  15/03/2022 14:24:06 | 1004.4 |
|  15/03/2022 14:54:06 | 1004.5 |
|  15/03/2022 15:24:06 | 1004.3 |
|  15/03/2022 15:54:06 | 1003.8 |
|  15/03/2022 16:24:06 | 1003.6 |
|  15/03/2022 16:54:06 | 1003.4 |
|  15/03/2022 17:24:06 | 1003.1 |
|  15/03/2022 17:54:06 | 1003.1 |
|  15/03/2022 18:24:06 | 1003 |
|  15/03/2022 18:54:06 | 1002.6 |
|  15/03/2022 19:24:06 | 1002.3 |
|  15/03/2022 19:54:06 | 1002.6 |
|  15/03/2022 20:24:06 | 1002.2 |
|  15/03/2022 20:54:06 | 1002.3 |
|  15/03/2022 21:24:06 | 1002.5 |
|  15/03/2022 21:54:06 | 1002.4 |
|  15/03/2022 22:24:06 | 1002.2 |
|  15/03/2022 22:54:06 | 1002.2 |
|  15/03/2022 23:24:06 | 1002.2 |
|  15/03/2022 23:54:06 | 1002.2 |
|  16/03/2022 00:24:06 | 1002.4 |
|  16/03/2022 00:54:06 | 1002.6 |
|  16/03/2022 01:24:06 | 1002.5 |
|  16/03/2022 01:54:06 | 1002.3 |
|  16/03/2022 02:24:06 | 1002.4 |
|  16/03/2022 02:54:06 | 1002.4 |
|  16/03/2022 03:24:06 | 1002.7 |
|  16/03/2022 03:54:06 | 1002.5 |
|  16/03/2022 04:24:06 | 1002.6 |
|  16/03/2022 04:54:06 | 1002.6 |
|  16/03/2022 05:24:06 | 1002.7 |
|  16/03/2022 05:54:06 | 1002.3 |
|  16/03/2022 06:24:06 | 1002.7 |
|  16/03/2022 06:54:06 | 1002.7 |
|  16/03/2022 07:24:06 | 1003 |
|  16/03/2022 07:54:06 | 1003.1 |
|  16/03/2022 08:24:06 | 1003.4 |
|  16/03/2022 08:54:06 | 1003.5 |
|  16/03/2022 09:24:06 | 1003.8 |
|  16/03/2022 09:54:06 | 1004 |
|  16/03/2022 10:24:06 | 1004.2 |
|  16/03/2022 10:54:06 | 1004.3 |
|  16/03/2022 11:24:06 | 1004.8 |
|  16/03/2022 11:54:06 | 1005 |
|  16/03/2022 12:24:06 | 1005.3 |
|  16/03/2022 12:54:06 | 1005.3 |
|  16/03/2022 13:24:06 | 1005.8 |
|  16/03/2022 13:54:06 | 1006 |
|  16/03/2022 14:24:06 | 1006.2 |
|  16/03/2022 14:54:06 | 1006.1 |
|  16/03/2022 15:24:06 | 1006.2 |
|  16/03/2022 15:54:06 | 1006.3 |
|  16/03/2022 16:24:06 | 1005.9 |
|  16/03/2022 16:54:06 | 1006 |
|  16/03/2022 17:24:06 | 1006.4 |
|  16/03/2022 17:54:06 | 1006.2 |
|  16/03/2022 18:24:06 | 1006.5 |
|  16/03/2022 18:54:06 | 1006.7 |
|  16/03/2022 19:24:06 | 1007.2 |
|  16/03/2022 19:54:06 | 1007.6 |
|  16/03/2022 20:24:06 | 1007.9 |
|  16/03/2022 20:54:06 | 1008.4 |
|  16/03/2022 21:24:06 | 1008.5 |
|  16/03/2022 21:54:06 | 1008.6 |
|  16/03/2022 22:24:06 | 1008.8 |
|  16/03/2022 22:54:06 | 1008.9 |
|  16/03/2022 23:24:06 | 1009 |
|  16/03/2022 23:54:06 | 1009.2 |
|  17/03/2022 00:24:06 | 1009.2 |
|  17/03/2022 00:54:06 | 1009.1 |
|  17/03/2022 01:24:06 | 1009.1 |
|  17/03/2022 01:54:06 | 1009.2 |
|  17/03/2022 02:24:06 | 1009.1 |
|  17/03/2022 02:54:06 | 1009.2 |
|  17/03/2022 03:24:06 | 1009.2 |
|  17/03/2022 03:54:06 | 1009.2 |
|  17/03/2022 04:24:06 | 1009.3 |
|  17/03/2022 04:54:06 | 1009.2 |
|  17/03/2022 05:24:06 | 1009.4 |
|  17/03/2022 05:54:06 | 1009.4 |
|  17/03/2022 06:24:06 | 1009.4 |
|  17/03/2022 06:54:06 | 1009.4 |
|  17/03/2022 07:24:06 | 1009.3 |
|  17/03/2022 07:54:06 | 1009.8 |
|  17/03/2022 08:24:06 | 1009.7 |
|  17/03/2022 08:54:06 | 1009.6 |
|  17/03/2022 09:24:06 | 1009.3 |
|  17/03/2022 09:54:06 | 1009.4 |
|  17/03/2022 10:24:06 | 1009.2 |
|  17/03/2022 10:54:06 | 1009.1 |
|  17/03/2022 11:24:06 | 1008.9 |
|  17/03/2022 11:54:06 | 1008.4 |
|  17/03/2022 12:24:06 | 1008.2 |
|  17/03/2022 12:54:06 | 1008.3 |
|  17/03/2022 13:24:06 | 1008.3 |
|  17/03/2022 13:54:06 | 1008.6 |
|  17/03/2022 14:24:06 | 1008.7 |
|  17/03/2022 14:54:06 | 1008 |
|  17/03/2022 15:24:06 | 1007.8 |
|  17/03/2022 15:54:06 | 1007.6 |
|  17/03/2022 16:24:06 | 1007.8 |
|  17/03/2022 16:54:06 | 1008.1 |
|  17/03/2022 17:24:06 | 1008.2 |
|  17/03/2022 17:54:06 | 1009.2 |
|  17/03/2022 18:24:06 | 1010 |
|  17/03/2022 18:54:06 | 1010.8 |
|  17/03/2022 19:24:06 | 1011.3 |
|  17/03/2022 19:54:06 | 1012.7 |
|  17/03/2022 20:24:06 | 1014.1 |
|  17/03/2022 20:54:06 | 1014.5 |
|  17/03/2022 21:24:06 | 1015.3 |
|  17/03/2022 21:54:06 | 1015.9 |
|  17/03/2022 22:24:06 | 1016.8 |
|  17/03/2022 22:54:06 | 1017.6 |
|  17/03/2022 23:24:06 | 1018.4 |
|  17/03/2022 23:54:06 | 1018.8 |
|  18/03/2022 00:24:06 | 1019.4 |
|  18/03/2022 00:54:06 | 1019.9 |
|  18/03/2022 01:24:06 | 1021.2 |
|  18/03/2022 01:54:06 | 1021.4 |
|  18/03/2022 02:24:06 | 1021.9 |
|  18/03/2022 02:54:06 | 1022.5 |
|  18/03/2022 03:24:06 | 1023 |
|  18/03/2022 03:54:06 | 1023.6 |
|  18/03/2022 04:24:06 | 1024 |
|  18/03/2022 04:54:06 | 1024.3 |
|  18/03/2022 05:24:06 | 1025 |
|  18/03/2022 05:54:06 | 1025.1 |
|  18/03/2022 06:24:06 | 1025.6 |
|  18/03/2022 06:54:06 | 1025.9 |
|  18/03/2022 07:24:06 | 1026.5 |
|  18/03/2022 07:54:06 | 1026.8 |
|  18/03/2022 08:24:06 | 1027.2 |
|  18/03/2022 08:54:06 | 1027.7 |
|  18/03/2022 09:24:06 | 1028.1 |
|  18/03/2022 09:54:06 | 1028.4 |
|  18/03/2022 10:24:06 | 1029 |
|  18/03/2022 10:54:06 | 1028.9 |
|  18/03/2022 11:24:06 | 1029.1 |
|  18/03/2022 11:54:06 | 1029.4 |
|  18/03/2022 12:24:06 | 1029.7 |
|  18/03/2022 12:54:06 | 1029.6 |
|  18/03/2022 13:24:06 | 1029.6 |
|  18/03/2022 13:54:06 | 1029.3 |
|  18/03/2022 14:24:06 | 1029.5 |
|  18/03/2022 14:54:06 | 1029.3 |
|  18/03/2022 15:24:06 | 1029.2 |
|  18/03/2022 15:54:06 | 1029.2 |
|  18/03/2022 16:24:06 | 1028.9 |
|  18/03/2022 16:54:06 | 1028.8 |
|  18/03/2022 17:24:06 | 1029.1 |
|  18/03/2022 17:54:06 | 1029.2 |
|  18/03/2022 18:24:06 | 1029.2 |
|  18/03/2022 18:54:06 | 1029.1 |
|  18/03/2022 19:24:06 | 1029.1 |
|  18/03/2022 19:54:06 | 1029.4 |
|  18/03/2022 20:24:06 | 1029.5 |
|  18/03/2022 20:54:06 | 1030 |
|  18/03/2022 21:24:06 | 1030.1 |
|  18/03/2022 21:54:06 | 1030.5 |
|  18/03/2022 22:24:06 | 1030.8 |
|  18/03/2022 22:54:06 | 1031 |
|  18/03/2022 23:24:06 | 1031.1 |
|  18/03/2022 23:54:06 | 1031.2 |
|  19/03/2022 00:24:06 | 1031.4 |
|  19/03/2022 00:54:06 | 1031.1 |
|  19/03/2022 01:24:06 | 1031.1 |
|  19/03/2022 01:54:06 | 1031.1 |
|  19/03/2022 02:24:06 | 1031.2 |
|  19/03/2022 02:54:06 | 1031.4 |
|  19/03/2022 03:24:06 | 1031.5 |
|  19/03/2022 03:54:06 | 1031.4 |
|  19/03/2022 04:24:06 | 1031.3 |
|  19/03/2022 04:54:06 | 1031 |
|  19/03/2022 05:24:06 | 1030.9 |
|  19/03/2022 05:54:06 | 1031.1 |
|  19/03/2022 06:24:06 | 1030.8 |
|  19/03/2022 06:54:06 | 1030.8 |
|  19/03/2022 07:24:06 | 1030.8 |
|  19/03/2022 07:54:06 | 1030.6 |
|  19/03/2022 08:24:06 | 1031 |
|  19/03/2022 08:54:06 | 1030.7 |
|  19/03/2022 09:24:06 | 1031 |
|  19/03/2022 09:54:06 | 1030.9 |
|  19/03/2022 10:24:06 | 1030.8 |
|  19/03/2022 10:54:06 | 1030.8 |
|  19/03/2022 11:24:06 | 1030.6 |
|  19/03/2022 11:54:06 | 1030.7 |
|  19/03/2022 12:24:06 | 1030.5 |
|  19/03/2022 12:54:06 | 1030.1 |
|  19/03/2022 13:24:06 | 1029.8 |
|  19/03/2022 13:54:06 | 1029.4 |
|  19/03/2022 14:24:06 | 1029.2 |
|  19/03/2022 14:54:06 | 1028.7 |
|  19/03/2022 15:24:06 | 1028.5 |
|  19/03/2022 15:54:06 | 1028.1 |
|  19/03/2022 16:24:06 | 1027.9 |
|  19/03/2022 16:54:06 | 1027.3 |
|  19/03/2022 17:24:06 | 1026.9 |
|  19/03/2022 17:54:06 | 1026.7 |
|  19/03/2022 18:24:06 | 1026.7 |
|  19/03/2022 18:54:06 | 1026.1 |
|  19/03/2022 19:24:06 | 1026.2 |
|  19/03/2022 19:54:06 | 1025.9 |
|  19/03/2022 20:24:06 | 1025.9 |
|  19/03/2022 20:54:06 | 1026.2 |
|  19/03/2022 21:24:06 | 1026.1 |
|  19/03/2022 21:54:06 | 1026.3 |
|  19/03/2022 22:24:06 | 1026.4 |
|  19/03/2022 22:54:06 | 1026.5 |
|  19/03/2022 23:24:06 | 1026.4 |
|  19/03/2022 23:54:06 | 1026.3 |
|  20/03/2022 00:24:06 | 1026.2 |
|  20/03/2022 00:54:06 | 1025.7 |
|  20/03/2022 01:24:06 | 1025.7 |
|  20/03/2022 01:54:06 | 1025.8 |
|  20/03/2022 02:24:06 | 1025.6 |
|  20/03/2022 02:54:06 | 1025.4 |
|  20/03/2022 03:24:06 | 1024.9 |
|  20/03/2022 03:54:06 | 1024.8 |
|  20/03/2022 04:24:06 | 1024.3 |
|  20/03/2022 04:54:06 | 1024 |
|  20/03/2022 05:24:06 | 1023.6 |
|  20/03/2022 05:54:06 | 1023.4 |
|  20/03/2022 06:24:06 | 1022.9 |
|  20/03/2022 06:54:06 | 1022.9 |
|  20/03/2022 07:24:06 | 1022.6 |
|  20/03/2022 07:54:06 | 1022.5 |
|  20/03/2022 08:24:06 | 1022.3 |
|  20/03/2022 08:54:06 | 1022.3 |
|  20/03/2022 09:24:06 | 1022 |
|  20/03/2022 09:54:06 | 1021.8 |
|  20/03/2022 10:24:06 | 1021.8 |
|  20/03/2022 10:54:06 | 1021.5 |
|  20/03/2022 11:24:06 | 1021.4 |
|  20/03/2022 11:54:06 | 1021.3 |
|  20/03/2022 12:24:06 | 1021 |
|  20/03/2022 12:54:06 | 1020.7 |
|  20/03/2022 13:24:06 | 1020.4 |
|  20/03/2022 13:54:06 | 1019.6 |
|  20/03/2022 14:24:06 | 1019.2 |
|  20/03/2022 14:54:06 | 1019 |
|  20/03/2022 15:24:06 | 1018.5 |
|  20/03/2022 15:54:06 | 1018.3 |
|  20/03/2022 16:24:06 | 1017.9 |
|  20/03/2022 16:54:06 | 1017.8 |
|  20/03/2022 17:24:06 | 1017.5 |
|  20/03/2022 17:54:06 | 1017 |
|  20/03/2022 18:24:06 | 1016.9 |
|  20/03/2022 18:54:06 | 1016.8 |
|  20/03/2022 19:24:06 | 1016.5 |
|  20/03/2022 19:54:06 | 1016.6 |
|  20/03/2022 20:24:06 | 1016.5 |
|  20/03/2022 20:54:06 | 1016.5 |
|  20/03/2022 21:24:06 | 1016.5 |
|  20/03/2022 21:54:06 | 1016.4 |
|  20/03/2022 22:24:06 | 1016.6 |
|  20/03/2022 22:54:06 | 1016.5 |
|  20/03/2022 23:24:06 | 1016.3 |
|  20/03/2022 23:54:06 | 1016.3 |
|  21/03/2022 00:24:06 | 1016.4 |
|  21/03/2022 00:54:06 | 1015.9 |
|  21/03/2022 01:24:06 | 1016 |
|  21/03/2022 01:54:06 | 1015.9 |
|  21/03/2022 02:24:06 | 1015.7 |
|  21/03/2022 02:54:06 | 1015.9 |
|  21/03/2022 03:24:06 | 1015.5 |
|  21/03/2022 03:54:06 | 1015.6 |
|  21/03/2022 04:24:06 | 1015.1 |
|  21/03/2022 04:54:06 | 1015.1 |
|  21/03/2022 05:24:06 | 1014.9 |
|  21/03/2022 05:54:06 | 1014.9 |
|  21/03/2022 06:24:06 | 1014.5 |
|  21/03/2022 06:54:06 | 1014.6 |
|  21/03/2022 07:24:06 | 1015.1 |
|  21/03/2022 07:54:06 | 1014.9 |
|  21/03/2022 08:24:06 | 1015 |
|  21/03/2022 08:54:06 | 1015.1 |
|  21/03/2022 09:24:06 | 1014.8 |
|  21/03/2022 09:54:06 | 1015 |
|  21/03/2022 10:24:06 | 1014.8 |
|  21/03/2022 10:54:06 | 1015 |
|  21/03/2022 11:24:06 | 1015 |
|  21/03/2022 11:54:06 | 1015 |
|  21/03/2022 12:24:06 | 1014.8 |
|  21/03/2022 12:54:06 | 1014.9 |
|  21/03/2022 13:24:06 | 1014.7 |
|  21/03/2022 13:54:06 | 1014.7 |
|  21/03/2022 14:24:06 | 1014.4 |
|  21/03/2022 14:54:06 | 1014.4 |
|  21/03/2022 15:24:06 | 1014.1 |
|  21/03/2022 15:54:06 | 1014 |
|  21/03/2022 16:24:06 | 1013.7 |
|  21/03/2022 16:54:06 | 1013.8 |
|  21/03/2022 17:24:06 | 1013.9 |
|  21/03/2022 17:54:06 | 1013.8 |
|  21/03/2022 18:24:06 | 1013.3 |
|  21/03/2022 18:54:06 | 1013.6 |
|  21/03/2022 19:24:06 | 1013.9 |
|  21/03/2022 19:54:06 | 1014.1 |
|  21/03/2022 20:24:06 | 1014.4 |
|  21/03/2022 20:54:06 | 1014.7 |
|  21/03/2022 21:24:06 | 1014.7 |
|  21/03/2022 21:54:06 | 1015.1 |
|  21/03/2022 22:24:06 | 1015.2 |
|  21/03/2022 22:54:06 | 1015.2 |
|  21/03/2022 23:24:06 | 1015.3 |
|  21/03/2022 23:54:06 | 1015.2 |
|  22/03/2022 00:24:06 | 1015.4 |
|  22/03/2022 00:54:06 | 1015.6 |
|  22/03/2022 01:24:06 | 1015.7 |
|  22/03/2022 01:54:06 | 1015.8 |
|  22/03/2022 02:24:06 | 1015.9 |
|  22/03/2022 02:54:06 | 1015.8 |
|  22/03/2022 03:24:06 | 1016.1 |
|  22/03/2022 03:54:06 | 1016.1 |
|  22/03/2022 04:24:06 | 1016.1 |
|  22/03/2022 04:54:06 | 1016.4 |
|  22/03/2022 05:25:06 | 1016.2 |
|  22/03/2022 05:55:06 | 1016.5 |
|  22/03/2022 06:25:06 | 1016.3 |
|  22/03/2022 06:55:06 | 1016.5 |
|  22/03/2022 07:25:06 | 1016.6 |
|  22/03/2022 07:55:06 | 1016.5 |
|  22/03/2022 08:25:06 | 1016.7 |
|  22/03/2022 08:55:06 | 1016.8 |
|  22/03/2022 09:25:06 | 1016.9 |
|  22/03/2022 09:55:06 | 1017 |
|  22/03/2022 10:25:06 | 1017.1 |
|  22/03/2022 10:55:06 | 1017.5 |
|  22/03/2022 11:25:06 | 1017.7 |
|  22/03/2022 11:55:06 | 1017.8 |
|  22/03/2022 12:25:06 | 1017.6 |
|  22/03/2022 12:55:06 | 1017.4 |
|  22/03/2022 13:25:06 | 1017.7 |
|  22/03/2022 13:55:06 | 1017.3 |
|  22/03/2022 14:25:06 | 1017.5 |
|  22/03/2022 14:55:06 | 1017.3 |
|  22/03/2022 15:25:06 | 1017.4 |
|  22/03/2022 15:55:06 | 1016.7 |
|  22/03/2022 16:25:06 | 1016.6 |
|  22/03/2022 16:55:06 | 1016.6 |
|  22/03/2022 17:25:06 | 1016.5 |
|  22/03/2022 17:55:06 | 1016.5 |
|  22/03/2022 18:25:06 | 1016.4 |
|  22/03/2022 18:55:06 | 1016.2 |
|  22/03/2022 19:25:06 | 1016.3 |
|  22/03/2022 19:55:06 | 1016.3 |
|  22/03/2022 20:25:06 | 1016.6 |
|  22/03/2022 20:55:06 | 1016.6 |
|  22/03/2022 21:25:06 | 1016.9 |
|  22/03/2022 21:55:06 | 1016.8 |
|  22/03/2022 22:25:06 | 1017.1 |
|  22/03/2022 22:55:06 | 1017.2 |
|  22/03/2022 23:25:06 | 1017.4 |
|  22/03/2022 23:55:06 | 1017.5 |
|  23/03/2022 00:25:06 | 1017.7 |
|  23/03/2022 00:55:06 | 1017.7 |
|  23/03/2022 01:25:06 | 1017.7 |
|  23/03/2022 01:55:06 | 1017.7 |
|  23/03/2022 02:25:06 | 1017.6 |
|  23/03/2022 02:55:06 | 1017.7 |
|  23/03/2022 03:25:06 | 1017.7 |
|  23/03/2022 03:55:06 | 1017.4 |
|  23/03/2022 04:25:06 | 1017.4 |
|  23/03/2022 04:55:06 | 1017.2 |
|  23/03/2022 05:25:06 | 1017.5 |
|  23/03/2022 05:55:06 | 1017.4 |
|  23/03/2022 06:25:06 | 1017.5 |
|  23/03/2022 06:55:06 | 1017.7 |
|  23/03/2022 07:25:06 | 1017.9 |
|  23/03/2022 07:55:06 | 1018 |
|  23/03/2022 08:25:06 | 1018.1 |
|  23/03/2022 08:55:06 | 1017.9 |
|  23/03/2022 09:25:06 | 1017.9 |
|  23/03/2022 09:55:06 | 1018.1 |
|  23/03/2022 10:25:06 | 1018.5 |
|  23/03/2022 10:55:06 | 1018.6 |
|  23/03/2022 11:25:06 | 1018.8 |
|  23/03/2022 11:55:06 | 1018.7 |
|  23/03/2022 12:25:06 | 1018.9 |
|  23/03/2022 12:55:06 | 1018.8 |
|  23/03/2022 13:25:06 | 1018.7 |
|  23/03/2022 13:55:06 | 1018.6 |
|  23/03/2022 14:25:06 | 1018.3 |
|  23/03/2022 14:55:06 | 1018.3 |
|  23/03/2022 15:25:06 | 1017.8 |
|  23/03/2022 15:55:06 | 1017.4 |
|  23/03/2022 16:25:06 | 1017.1 |
|  23/03/2022 16:55:06 | 1016.9 |
|  23/03/2022 17:25:06 | 1016.6 |
|  23/03/2022 17:55:06 | 1016.6 |
|  23/03/2022 18:25:06 | 1016.4 |
|  23/03/2022 18:55:06 | 1016.6 |
|  23/03/2022 19:25:06 | 1016.4 |
|  23/03/2022 19:55:06 | 1016.7 |
|  23/03/2022 20:25:06 | 1016.9 |
|  23/03/2022 20:55:06 | 1016.8 |
|  23/03/2022 21:25:06 | 1016.9 |
|  23/03/2022 21:55:06 | 1017.3 |
|  23/03/2022 22:25:06 | 1017.2 |
|  23/03/2022 22:55:06 | 1017.2 |
|  23/03/2022 23:25:06 | 1017.2 |
|  23/03/2022 23:55:06 | 1017.3 |
|  24/03/2022 00:25:06 | 1017.2 |
|  24/03/2022 00:55:06 | 1017.1 |
|  24/03/2022 01:25:06 | 1017.2 |
|  24/03/2022 01:55:06 | 1017 |
|  24/03/2022 02:25:06 | 1017 |
|  24/03/2022 02:55:06 | 1016.7 |
|  24/03/2022 03:25:06 | 1016.7 |
|  24/03/2022 03:55:06 | 1016.6 |
|  24/03/2022 04:25:06 | 1017 |
|  24/03/2022 04:55:06 | 1016.6 |
|  24/03/2022 05:25:06 | 1016.3 |
|  24/03/2022 05:55:06 | 1016.2 |
|  24/03/2022 06:25:06 | 1016.2 |
|  24/03/2022 06:55:06 | 1016.2 |
|  24/03/2022 07:25:06 | 1016.3 |
|  24/03/2022 07:55:06 | 1016.3 |
|  24/03/2022 08:25:06 | 1016.3 |
|  24/03/2022 08:55:06 | 1016.1 |
|  24/03/2022 09:25:06 | 1016.1 |
|  24/03/2022 09:55:06 | 1016.5 |
|  24/03/2022 10:25:06 | 1016.4 |
|  24/03/2022 10:55:06 | 1016.4 |
|  24/03/2022 11:25:06 | 1016.7 |
|  24/03/2022 11:55:06 | 1016.9 |
|  24/03/2022 12:25:06 | 1017 |
|  24/03/2022 12:55:06 | 1016.7 |
|  24/03/2022 13:25:06 | 1017 |
|  24/03/2022 13:55:06 | 1017.2 |
|  24/03/2022 14:25:06 | 1016.9 |
|  24/03/2022 14:55:06 | 1016.7 |
|  24/03/2022 15:25:06 | 1016.4 |
|  24/03/2022 15:55:06 | 1016 |
|  24/03/2022 16:25:06 | 1016.1 |
|  24/03/2022 16:55:06 | 1015.8 |
|  24/03/2022 17:25:06 | 1016 |
|  24/03/2022 17:55:06 | 1016 |
|  24/03/2022 18:25:06 | 1015.9 |
|  24/03/2022 18:55:06 | 1016 |
|  24/03/2022 19:25:06 | 1016.1 |
|  24/03/2022 19:55:06 | 1015.9 |
|  24/03/2022 20:25:06 | 1016.2 |
|  24/03/2022 20:55:06 | 1016.4 |
|  24/03/2022 21:25:06 | 1016.6 |
|  24/03/2022 21:55:06 | 1016.8 |
|  24/03/2022 22:25:06 | 1017.1 |
|  24/03/2022 22:55:06 | 1017.2 |
|  24/03/2022 23:25:06 | 1017.6 |
|  24/03/2022 23:55:06 | 1017.4 |
|  25/03/2022 00:25:06 | 1017.6 |
|  25/03/2022 00:55:06 | 1017.7 |
|  25/03/2022 01:25:06 | 1017.9 |
|  25/03/2022 01:55:06 | 1017.9 |
|  25/03/2022 02:25:06 | 1017.8 |
|  25/03/2022 02:55:06 | 1018.1 |
|  25/03/2022 03:25:06 | 1017.9 |
|  25/03/2022 03:55:06 | 1018.2 |
|  25/03/2022 04:25:06 | 1018.1 |
|  25/03/2022 04:55:06 | 1017.9 |
|  25/03/2022 05:25:06 | 1018 |
|  25/03/2022 05:55:06 | 1018.2 |
|  25/03/2022 06:25:06 | 1018.5 |
|  25/03/2022 06:55:06 | 1018.6 |
|  25/03/2022 07:25:06 | 1018.9 |
|  25/03/2022 07:55:06 | 1019 |
|  25/03/2022 08:25:06 | 1019 |
|  25/03/2022 08:55:06 | 1019.3 |
|  25/03/2022 09:25:06 | 1019.5 |
|  25/03/2022 09:55:06 | 1019.9 |
|  25/03/2022 10:25:06 | 1020 |
|  25/03/2022 10:55:06 | 1020 |
|  25/03/2022 11:25:06 | 1020.1 |
|  25/03/2022 11:55:06 | 1020 |
|  25/03/2022 12:25:06 | 1020 |
|  25/03/2022 12:55:06 | 1019.8 |
|  25/03/2022 13:25:06 | 1019.8 |
|  25/03/2022 13:55:06 | 1019.7 |
|  25/03/2022 14:25:06 | 1019.7 |
|  25/03/2022 14:55:06 | 1019.5 |
|  25/03/2022 15:25:06 | 1019.3 |
|  25/03/2022 15:55:06 | 1019.7 |
|  25/03/2022 16:25:06 | 1019.3 |
|  25/03/2022 16:55:06 | 1018.8 |
|  25/03/2022 17:25:06 | 1018.7 |
|  25/03/2022 17:55:06 | 1018.5 |
|  25/03/2022 18:25:06 | 1018.8 |
|  25/03/2022 18:55:06 | 1018.7 |
|  25/03/2022 19:25:06 | 1018.6 |
|  25/03/2022 19:55:06 | 1019 |
|  25/03/2022 20:25:06 | 1019.4 |
|  25/03/2022 20:55:06 | 1019.5 |
|  25/03/2022 21:25:06 | 1019.7 |
|  25/03/2022 21:55:06 | 1019.9 |
|  25/03/2022 22:25:06 | 1020.1 |
|  25/03/2022 22:55:06 | 1020.3 |
|  25/03/2022 23:25:06 | 1020.3 |
|  25/03/2022 23:55:06 | 1020.5 |
|  26/03/2022 00:25:06 | 1020.9 |
|  26/03/2022 00:55:06 | 1020.9 |
|  26/03/2022 01:25:06 | 1021.1 |
|  26/03/2022 01:55:06 | 1021.2 |
|  26/03/2022 02:25:06 | 1021.7 |
|  26/03/2022 02:55:06 | 1021.6 |
|  26/03/2022 03:25:06 | 1021.9 |
|  26/03/2022 03:55:06 | 1021.8 |
|  26/03/2022 04:25:06 | 1021.7 |
|  26/03/2022 04:55:06 | 1022 |
|  26/03/2022 05:25:06 | 1021.9 |
|  26/03/2022 05:55:06 | 1021.9 |
|  26/03/2022 06:25:06 | 1021.7 |
|  26/03/2022 06:55:06 | 1021.9 |
|  26/03/2022 07:25:06 | 1022.2 |
|  26/03/2022 07:55:06 | 1022.1 |
|  26/03/2022 08:25:06 | 1022.5 |
|  26/03/2022 08:55:06 | 1023 |
|  26/03/2022 09:25:06 | 1022.8 |
|  26/03/2022 09:55:06 | 1022.9 |
|  26/03/2022 10:25:06 | 1023.1 |
|  26/03/2022 10:55:06 | 1023.3 |
|  26/03/2022 11:25:06 | 1023.4 |
|  26/03/2022 11:55:06 | 1023.4 |
|  26/03/2022 12:25:06 | 1023.3 |
|  26/03/2022 12:55:06 | 1023.2 |
|  26/03/2022 13:25:06 | 1023.6 |
|  26/03/2022 13:55:06 | 1023.2 |
|  26/03/2022 14:25:06 | 1022.9 |
|  26/03/2022 14:55:06 | 1022.9 |
|  26/03/2022 15:25:06 | 1022.7 |
|  26/03/2022 15:55:06 | 1022.5 |
|  26/03/2022 16:25:06 | 1022.3 |
|  26/03/2022 16:55:06 | 1022 |
|  26/03/2022 17:25:06 | 1022 |
|  26/03/2022 17:55:06 | 1021.8 |
|  26/03/2022 18:25:06 | 1021.8 |
|  26/03/2022 18:55:06 | 1021.7 |
|  26/03/2022 19:25:06 | 1021.7 |
|  26/03/2022 19:55:06 | 1021.6 |
|  26/03/2022 20:25:06 | 1021.6 |
|  26/03/2022 20:55:06 | 1021.8 |
|  26/03/2022 21:25:06 | 1022.1 |
|  26/03/2022 21:55:06 | 1022.1 |
|  26/03/2022 22:25:06 | 1022.1 |
|  26/03/2022 22:55:06 | 1022.4 |
|  26/03/2022 23:25:06 | 1022.2 |
|  26/03/2022 23:55:06 | 1023 |
|  27/03/2022 00:25:06 | 1022.9 |
|  27/03/2022 00:55:06 | 1023.2 |
|  27/03/2022 01:25:06 | 1023.3 |
|  27/03/2022 01:55:06 | 1023.5 |
|  27/03/2022 02:25:06 | 1023.4 |
|  27/03/2022 02:55:06 | 1023.3 |
|  27/03/2022 03:25:06 | 1023.3 |
|  27/03/2022 03:55:06 | 1023.5 |
|  27/03/2022 04:25:06 | 1023.4 |
|  27/03/2022 04:55:06 | 1023.1 |
|  27/03/2022 05:25:06 | 1022.8 |
|  27/03/2022 05:55:06 | 1022.8 |
|  27/03/2022 06:25:06 | 1022.8 |
|  27/03/2022 06:55:06 | 1022.7 |
|  27/03/2022 07:25:06 | 1022.7 |
|  27/03/2022 07:55:06 | 1022.5 |
|  27/03/2022 08:25:06 | 1022.5 |
|  27/03/2022 08:55:06 | 1022.2 |
|  27/03/2022 09:25:06 | 1022.3 |
|  27/03/2022 09:55:06 | 1021.9 |
|  27/03/2022 10:25:06 | 1021.8 |
|  27/03/2022 10:55:06 | 1021.8 |
|  27/03/2022 11:25:06 | 1021.8 |
|  27/03/2022 11:55:06 | 1020.5 |
|  27/03/2022 12:25:06 | 1019.8 |
|  27/03/2022 12:55:06 | 1019.5 |
|  27/03/2022 13:25:06 | 1019.3 |
|  27/03/2022 13:55:06 | 1019 |
|  27/03/2022 14:25:06 | 1018.8 |
|  27/03/2022 14:55:06 | 1018.5 |
|  27/03/2022 15:25:06 | 1018.3 |
|  27/03/2022 15:55:06 | 1018 |
|  27/03/2022 16:25:06 | 1017.8 |
|  27/03/2022 16:55:06 | 1017.4 |
|  27/03/2022 17:25:06 | 1017.2 |
|  27/03/2022 17:55:06 | 1017.1 |
|  27/03/2022 18:25:06 | 1016.6 |
|  27/03/2022 18:55:06 | 1016.4 |
|  27/03/2022 19:25:06 | 1016.5 |
|  27/03/2022 19:55:06 | 1016.4 |
|  27/03/2022 20:25:06 | 1016.8 |
|  27/03/2022 20:55:06 | 1016.8 |
|  27/03/2022 21:25:06 | 1017 |
|  27/03/2022 21:55:06 | 1016.8 |
|  27/03/2022 22:25:06 | 1016.6 |
|  27/03/2022 22:55:06 | 1016.5 |
|  27/03/2022 23:25:06 | 1016.7 |
|  27/03/2022 23:55:06 | 1016.3 |
|  28/03/2022 00:25:06 | 1016.3 |
|  28/03/2022 00:55:06 | 1016.2 |
|  28/03/2022 01:25:06 | 1015.6 |
|  28/03/2022 01:55:06 | 1015.6 |
|  28/03/2022 02:25:06 | 1015.3 |
|  28/03/2022 02:55:06 | 1015 |
|  28/03/2022 03:25:06 | 1014.6 |
|  28/03/2022 03:55:06 | 1014.3 |
|  28/03/2022 04:25:06 | 1014.1 |
|  28/03/2022 04:55:06 | 1013.9 |
|  28/03/2022 05:25:06 | 1013.6 |
|  28/03/2022 05:55:06 | 1013.5 |
|  28/03/2022 06:25:06 | 1013.6 |
|  28/03/2022 06:55:06 | 1013.2 |
|  28/03/2022 07:25:06 | 1013.1 |
|  28/03/2022 07:55:06 | 1013.2 |
|  28/03/2022 08:25:06 | 1013 |
|  28/03/2022 08:55:06 | 1013.1 |
|  28/03/2022 09:25:06 | 1012.7 |
|  28/03/2022 09:55:06 | 1012.4 |
|  28/03/2022 10:25:06 | 1012.3 |
|  28/03/2022 10:55:06 | 1011.8 |
|  28/03/2022 11:25:06 | 1011.9 |
|  28/03/2022 11:55:06 | 1011.3 |
|  28/03/2022 12:25:06 | 1011.2 |
|  28/03/2022 12:55:06 | 1010.9 |
|  28/03/2022 13:25:06 | 1010.3 |
|  28/03/2022 13:55:06 | 1010.2 |
|  28/03/2022 14:25:06 | 1009.8 |
|  28/03/2022 14:55:06 | 1009.4 |
|  28/03/2022 15:25:06 | 1009.2 |
|  28/03/2022 15:55:06 | 1008.8 |
|  28/03/2022 16:25:06 | 1008.6 |
|  28/03/2022 16:55:06 | 1008.3 |
|  28/03/2022 17:25:06 | 1008.5 |
|  28/03/2022 17:55:06 | 1008.4 |
|  28/03/2022 18:25:06 | 1008.2 |
|  28/03/2022 18:55:06 | 1008.3 |
|  28/03/2022 19:25:06 | 1008 |
|  28/03/2022 19:55:06 | 1008.3 |
|  28/03/2022 20:25:06 | 1008 |
|  28/03/2022 20:55:06 | 1007.8 |
|  28/03/2022 21:25:06 | 1007.7 |
|  28/03/2022 21:55:06 | 1007.5 |
|  28/03/2022 22:25:06 | 1007 |
|  28/03/2022 22:55:06 | 1007.3 |
|  28/03/2022 23:25:06 | 1007.3 |
|  28/03/2022 23:55:06 | 1006.8 |
|  29/03/2022 00:25:06 | 1006.5 |
|  29/03/2022 00:55:06 | 1006.4 |
|  29/03/2022 01:25:06 | 1006.3 |
|  29/03/2022 01:55:06 | 1005.9 |
|  29/03/2022 02:25:06 | 1005.9 |
|  29/03/2022 02:55:06 | 1005.8 |
|  29/03/2022 03:25:06 | 1005.5 |
|  29/03/2022 03:55:06 | 1005.2 |
|  29/03/2022 04:25:06 | 1004.6 |
|  29/03/2022 04:55:06 | 1004.3 |
|  29/03/2022 05:25:06 | 1004.1 |
|  29/03/2022 05:55:06 | 1004 |
|  29/03/2022 06:25:06 | 1003.8 |
|  29/03/2022 06:55:06 | 1003.9 |
|  29/03/2022 07:25:06 | 1003.9 |
|  29/03/2022 07:55:06 | 1004 |
|  29/03/2022 08:25:06 | 1004.1 |
|  29/03/2022 08:55:06 | 1004.3 |
|  29/03/2022 09:25:06 | 1004.3 |
|  29/03/2022 09:55:06 | 1004.1 |
|  29/03/2022 10:25:06 | 1004.1 |
|  29/03/2022 10:55:06 | 1003.8 |
|  29/03/2022 11:25:06 | 1004.1 |
|  29/03/2022 11:55:06 | 1003.7 |
|  29/03/2022 12:25:06 | 1003.7 |
|  29/03/2022 12:55:06 | 1003.4 |
|  29/03/2022 13:25:06 | 1003.4 |
|  29/03/2022 13:55:06 | 1002.9 |
|  29/03/2022 14:25:06 | 1002.7 |
|  29/03/2022 14:55:06 | 1002.4 |
|  29/03/2022 15:25:06 | 1002 |
|  29/03/2022 15:55:06 | 1002.1 |
|  29/03/2022 16:25:06 | 1002 |
|  29/03/2022 16:55:06 | 1002 |
|  29/03/2022 17:25:06 | 1001.8 |
|  29/03/2022 17:55:06 | 1001.8 |
|  29/03/2022 18:25:06 | 1001.9 |
|  29/03/2022 18:55:06 | 1001.8 |
|  29/03/2022 19:25:06 | 1002 |
|  29/03/2022 19:55:06 | 1002.1 |
|  29/03/2022 20:25:06 | 1002.3 |
|  29/03/2022 20:55:06 | 1002.1 |
|  29/03/2022 21:25:06 | 1001.9 |
|  29/03/2022 21:55:06 | 1001.7 |
|  29/03/2022 22:25:06 | 1002 |
|  29/03/2022 22:55:06 | 1002.1 |
|  29/03/2022 23:25:06 | 1001.8 |
|  29/03/2022 23:55:06 | 1001.6 |
|  30/03/2022 00:25:06 | 1001.8 |
|  30/03/2022 00:55:06 | 1001.6 |
|  30/03/2022 01:25:06 | 1001.4 |
|  30/03/2022 01:55:06 | 1001.5 |
|  30/03/2022 02:25:06 | 1001.4 |
|  30/03/2022 02:55:06 | 1001.1 |
|  30/03/2022 03:25:06 | 1001 |
|  30/03/2022 03:55:06 | 1000.9 |
|  30/03/2022 04:25:06 | 1000.8 |
|  30/03/2022 04:55:06 | 1000.8 |
|  30/03/2022 05:25:06 | 1000.7 |
|  30/03/2022 05:55:06 | 1001 |
|  30/03/2022 06:25:06 | 1000.8 |
|  30/03/2022 06:55:06 | 1000.7 |
|  30/03/2022 07:25:06 | 1001.1 |
|  30/03/2022 07:55:06 | 1001 |
|  30/03/2022 08:25:06 | 1001 |
|  30/03/2022 08:55:06 | 1001.1 |
|  30/03/2022 09:25:06 | 1001.1 |
|  30/03/2022 09:55:06 | 1001.1 |
|  30/03/2022 10:25:06 | 1001.3 |
|  30/03/2022 10:55:06 | 1000.9 |
|  30/03/2022 11:25:06 | 1000.9 |
|  30/03/2022 11:55:06 | 1000.8 |
|  30/03/2022 12:25:06 | 1000.8 |
|  30/03/2022 12:55:06 | 1000.6 |
|  30/03/2022 13:25:06 | 1000.5 |
|  30/03/2022 13:55:06 | 1000.3 |
|  30/03/2022 14:25:06 | 1000 |
|  30/03/2022 14:55:06 | 1000.1 |
|  30/03/2022 15:25:06 | 999.9 |
|  30/03/2022 15:55:06 | 1000 |
|  30/03/2022 16:25:06 | 1000.2 |
|  30/03/2022 16:55:06 | 1000.3 |
|  30/03/2022 17:25:06 | 1000.3 |
|  30/03/2022 17:55:06 | 1000.6 |
|  30/03/2022 18:25:06 | 1000.9 |
|  30/03/2022 18:55:06 | 1001.4 |
|  30/03/2022 19:25:06 | 1001.5 |
|  30/03/2022 19:55:06 | 1001.8 |
|  30/03/2022 20:25:06 | 1001.9 |
|  30/03/2022 20:55:06 | 1002.2 |
|  30/03/2022 21:25:06 | 1002.4 |
|  30/03/2022 21:55:06 | 1002.5 |
|  30/03/2022 22:25:06 | 1003.1 |
|  30/03/2022 22:55:06 | 1003.2 |
|  30/03/2022 23:25:06 | 1003.1 |
|  30/03/2022 23:55:06 | 1003.5 |
|  31/03/2022 00:25:06 | 1003.7 |
|  31/03/2022 00:55:06 | 1004.1 |
|  31/03/2022 01:25:06 | 1004.2 |
|  31/03/2022 01:55:06 | 1004.6 |
|  31/03/2022 02:25:06 | 1004.5 |
|  31/03/2022 02:55:06 | 1004.6 |
|  31/03/2022 03:25:06 | 1004.5 |
|  31/03/2022 03:55:06 | 1004.5 |
|  31/03/2022 04:25:06 | 1005 |
|  31/03/2022 04:55:06 | 1004.9 |
|  31/03/2022 05:25:06 | 1004.9 |
|  31/03/2022 05:55:06 | 1005.3 |
|  31/03/2022 06:25:06 | 1005.3 |
|  31/03/2022 06:55:06 | 1005.6 |
|  31/03/2022 07:25:06 | 1005.7 |
|  31/03/2022 07:55:06 | 1005.9 |
|  31/03/2022 08:25:06 | 1006.1 |
|  31/03/2022 08:55:06 | 1006.1 |
|  31/03/2022 09:25:06 | 1006.3 |
|  31/03/2022 09:55:06 | 1006.4 |
|  31/03/2022 10:25:06 | 1006.4 |
|  31/03/2022 10:55:06 | 1006.4 |
|  31/03/2022 11:25:06 | 1006.7 |
|  31/03/2022 11:55:06 | 1006.6 |
|  31/03/2022 12:25:06 | 1006.7 |
|  31/03/2022 12:55:06 | 1006.3 |
|  31/03/2022 13:25:06 | 1006.5 |
|  31/03/2022 13:55:06 | 1006.4 |
|  31/03/2022 14:25:06 | 1006.2 |
|  31/03/2022 14:55:06 | 1006.1 |
|  31/03/2022 15:25:06 | 1006.3 |
|  31/03/2022 15:55:06 | 1006 |
|  31/03/2022 16:25:06 | 1006.2 |
|  31/03/2022 16:55:06 | 1006.2 |
|  31/03/2022 17:25:06 | 1006.6 |
|  31/03/2022 17:55:06 | 1006.7 |
|  31/03/2022 18:25:06 | 1006.8 |
|  31/03/2022 18:55:06 | 1007 |
|  31/03/2022 19:25:06 | 1007.4 |
|  31/03/2022 19:55:06 | 1007.7 |
|  31/03/2022 20:25:06 | 1007.8 |
|  31/03/2022 20:55:06 | 1008.3 |
|  31/03/2022 21:25:06 | 1008.3 |
|  31/03/2022 21:55:06 | 1008.6 |
|  31/03/2022 22:25:06 | 1008.5 |
|  31/03/2022 22:55:06 | 1008.6 |
|  31/03/2022 23:25:06 | 1008.6 |
|  31/03/2022 23:55:06 | 1009.1 |